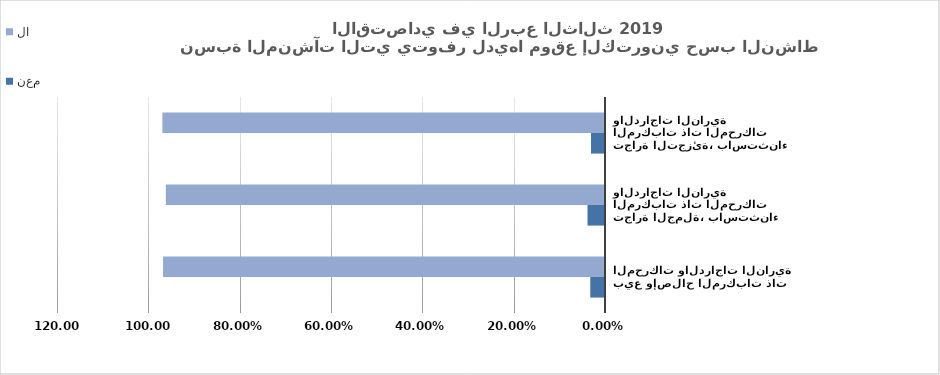
| Category | نعم | لا |
|---|---|---|
| بيع وإصلاح المركبات ذات المحركات والدراجات النارية | 0.032 | 0.968 |
| تجارة الجملة، باستثناء المركبات ذات المحركات والدراجات النارية | 0.038 | 0.962 |
| تجارة التجزئة، باستثناء المركبات ذات المحركات والدراجات النارية | 0.031 | 0.969 |